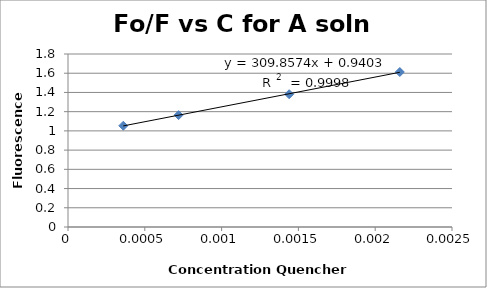
| Category | Series 0 |
|---|---|
| 0.00036 | 1.053 |
| 0.00072 | 1.164 |
| 0.0014399999999999999 | 1.382 |
| 0.00216 | 1.612 |